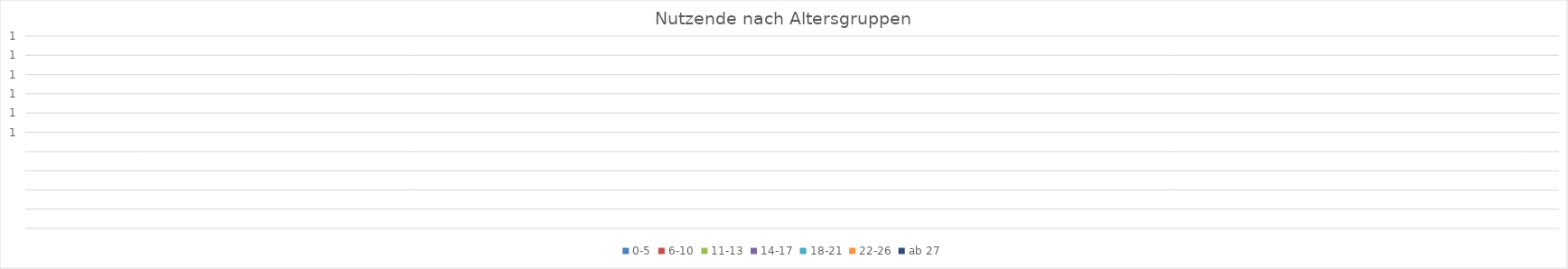
| Category | 0-5 | 6-10 | 11-13 | 14-17 | 18-21 | 22-26 | ab 27 |
|---|---|---|---|---|---|---|---|
| 0 | 0 | 0 | 0 | 0 | 0 | 0 | 0 |